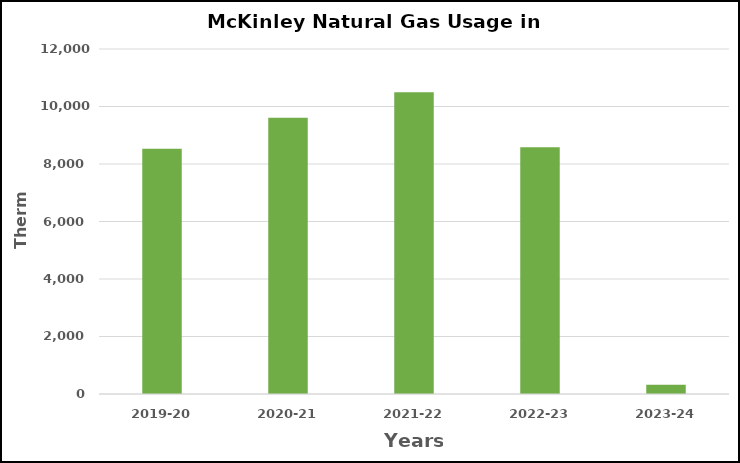
| Category | Series 0 |
|---|---|
| 2019-20 | 8534 |
| 2020-21 | 9606 |
| 2021-22 | 10495 |
| 2022-23 | 8580 |
| 2023-24 | 320 |